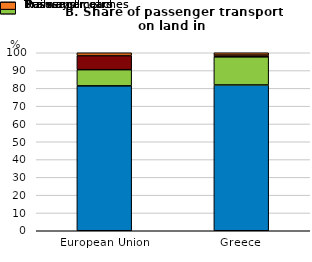
| Category | Passenger cars | Buses and coaches | Railways | Tram and metro |
|---|---|---|---|---|
| European Union | 81.4 | 9.1 | 7.9 | 1.6 |
| Greece | 81.9 | 15.8 | 1 | 1.3 |